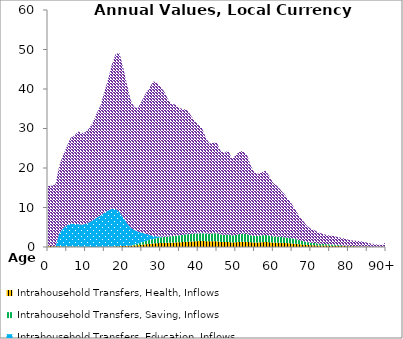
| Category | Intrahousehold Transfers, Health, Inflows | Intrahousehold Transfers, Saving, Inflows | Intrahousehold Transfers, Education, Inflows | Intrahousehold Transfers, Consumption other than health and education, Inflows |
|---|---|---|---|---|
| 0 | 253.415 | 0 | 0 | 15170.703 |
|  | 216.858 | 0 | 0 | 15291.168 |
| 2 | 184.444 | 0 | 0 | 15739.974 |
| 3 | 164.802 | 0 | 3310.37 | 17135.634 |
| 4 | 149.259 | 0 | 4572.902 | 18518.77 |
| 5 | 139.627 | 0 | 5333.283 | 19934.306 |
| 6 | 131.684 | 0 | 5800.832 | 21705.457 |
| 7 | 110.922 | 0 | 5733.994 | 22359.849 |
| 8 | 86.873 | 0 | 5696.935 | 23456.3 |
| 9 | 62.221 | 0 | 5601.183 | 23209.582 |
| 10 | 41.736 | 0 | 5777.707 | 23257.338 |
| 11 | 30.988 | 0 | 6181.905 | 23891.761 |
| 12 | 26.395 | 0 | 6782.964 | 24857.928 |
| 13 | 27.895 | 0 | 7433.559 | 26455.297 |
| 14 | 36.147 | 0 | 7956.546 | 27877.066 |
| 15 | 52.025 | 0 | 8642.182 | 30601.163 |
| 16 | 78.029 | 0 | 9153.788 | 33209.785 |
| 17 | 111.7 | 0 | 9541.332 | 36607.683 |
| 18 | 162.631 | 0 | 9485.536 | 39165.253 |
| 19 | 213.577 | 0 | 8730.776 | 40228.479 |
| 20 | 253.614 | 0 | 7276.066 | 38010.433 |
| 21 | 284.124 | 0 | 5814.811 | 35199.812 |
| 22 | 332.421 | 0 | 4579.272 | 32380.772 |
| 23 | 393.877 | 275.763 | 3645.814 | 30971.631 |
| 24 | 478.486 | 402.08 | 3019.827 | 31380.976 |
| 25 | 586.192 | 589.199 | 2449.979 | 33390.535 |
| 26 | 703.974 | 811.563 | 1887.166 | 35435.746 |
| 27 | 800.559 | 978.721 | 1284.687 | 37228.417 |
| 28 | 897.153 | 1153.029 | 784.453 | 39061.844 |
| 29 | 962.58 | 1295.506 | 397.905 | 39053.25 |
| 30 | 1015.486 | 1406.174 | 201.073 | 37901.849 |
| 31 | 1052.562 | 1475.967 | 79.13 | 36659.249 |
| 32 | 1078.798 | 1552.669 | 40.107 | 34637.154 |
| 33 | 1106.325 | 1618.855 | 32.406 | 33466.094 |
| 34 | 1159.567 | 1713.653 | 35.424 | 33151.066 |
| 35 | 1187.327 | 1738.173 | 39.147 | 32248.589 |
| 36 | 1256.989 | 1830.061 | 36.768 | 31765.357 |
| 37 | 1339.631 | 1897.605 | 31.964 | 31593.772 |
| 38 | 1389.244 | 1897.945 | 30.665 | 30049.493 |
| 39 | 1438.418 | 1904.374 | 31.656 | 28649.997 |
| 40 | 1495.414 | 1939.528 | 33.792 | 27582.972 |
| 41 | 1525.251 | 1951.148 | 33.525 | 26558.531 |
| 42 | 1473.03 | 1921.189 | 32.66 | 24331.545 |
| 43 | 1426.902 | 1911.855 | 0 | 22848.081 |
| 44 | 1448.028 | 2009.187 | 0 | 22932.144 |
| 45 | 1438.114 | 2064.313 | 0 | 22834.184 |
| 46 | 1299.533 | 1896.674 | 0 | 21046.772 |
| 47 | 1243.453 | 1844.743 | 0 | 20748.103 |
| 48 | 1258.114 | 1910.036 | 0 | 21276.119 |
| 49 | 1147.537 | 1755.31 | 0 | 19395.331 |
| 50 | 1203.886 | 1851.016 | 0 | 20244.009 |
| 51 | 1281.328 | 1987.34 | 0 | 20957.351 |
| 52 | 1327.777 | 2033.732 | 0 | 20946.143 |
| 53 | 1309.384 | 1970.814 | 0 | 19995.299 |
| 54 | 1193.392 | 1761.337 | 0 | 17634.909 |
| 55 | 1137.049 | 1656.51 | 0 | 15990.764 |
| 56 | 1151.049 | 1659.048 | 0 | 15699.332 |
| 57 | 1211.998 | 1737.644 | 0 | 16011.437 |
| 58 | 1268.625 | 1799.597 | 0 | 16283.624 |
| 59 | 1198.148 | 1686.95 | 0 | 14910.512 |
| 60 | 1116.07 | 1570.342 | 0 | 13487.774 |
| 61 | 1105.526 | 1540.574 | 0 | 12824.887 |
| 62 | 1066.76 | 1476.354 | 0 | 11848.837 |
| 63 | 1023.404 | 1425.297 | 0 | 10846.037 |
| 64 | 969.816 | 1380.897 | 0 | 9744.463 |
| 65 | 900.863 | 1287.029 | 0 | 8579.305 |
| 66 | 809.124 | 1177.998 | 0 | 7267.256 |
| 67 | 696.366 | 1031.109 | 0 | 5965.635 |
| 68 | 609.974 | 903.255 | 0 | 5014.876 |
| 69 | 504.049 | 733.171 | 0 | 4053.391 |
| 70 | 455.574 | 636.106 | 0 | 3529.585 |
| 71 | 429.33 | 567.727 | 0 | 3239.987 |
| 72 | 388.446 | 483.753 | 0 | 2806.92 |
| 73 | 371.68 | 433.022 | 0 | 2573.571 |
| 74 | 359.438 | 375.615 | 0 | 2364.971 |
| 75 | 338.455 | 321.728 | 0 | 2250.341 |
| 76 | 323.177 | 273.095 | 0 | 2188.766 |
| 77 | 292.743 | 216.921 | 0 | 2042.824 |
| 78 | 262.68 | 166.415 | 0 | 1909.222 |
| 79 | 237.439 | 132.667 | 0 | 1815.166 |
| 80 | 192.841 | 95.496 | 0 | 1532.106 |
| 81 | 167.458 | 73.23 | 0 | 1386.638 |
| 82 | 155.326 | 58.353 | 0 | 1349.711 |
| 83 | 145.8 | 48.519 | 0 | 1320.764 |
| 84 | 127.355 | 0 | 0 | 1194.705 |
| 85 | 100.362 | 0 | 0 | 974.895 |
| 86 | 80.125 | 0 | 0 | 799.216 |
| 87 | 65.719 | 0 | 0 | 666.427 |
| 88 | 53.091 | 0 | 0 | 543.606 |
| 89 | 41.75 | 0 | 0 | 430.366 |
| 90+ | 119.206 | 0 | 0 | 1236.879 |